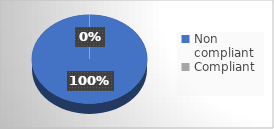
| Category | Series 0 |
|---|---|
| Non compliant | 10 |
| Compliant | 0 |